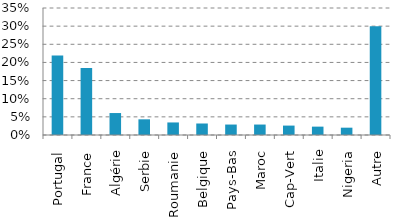
| Category | Series 0 |
|---|---|
| Portugal | 0.219 |
| France | 0.184 |
| Algérie | 0.061 |
| Serbie | 0.043 |
| Roumanie | 0.035 |
| Belgique | 0.032 |
| Pays-Bas | 0.029 |
| Maroc | 0.029 |
| Cap-Vert | 0.026 |
| Italie | 0.023 |
| Nigeria | 0.02 |
| Autre | 0.3 |